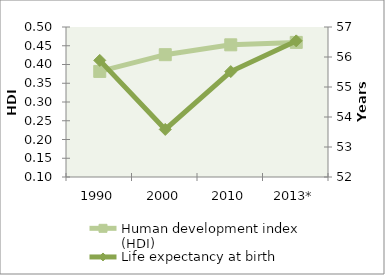
| Category | Human development index (HDI) |
|---|---|
| 1990 | 0.382 |
| 2000 | 0.426 |
| 2010 | 0.452 |
| 2013* | 0.459 |